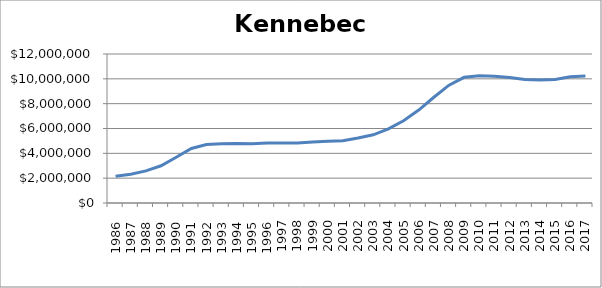
| Category | Kennebec (000s) |
|---|---|
|       1986 | 2160900 |
|       1987 | 2319050 |
|       1988 | 2584950 |
|       1989 | 2997750 |
|       1990 | 3680200 |
|       1991 | 4391200 |
|       1992 | 4715000 |
|       1993 | 4767550 |
|       1994 | 4791700 |
|       1995 | 4776250 |
|       1996 | 4825650 |
| 1997 | 4824650 |
| 1998 | 4836450 |
| 1999 | 4917550 |
| 2000 | 4970550 |
| 2001 | 5010300 |
| 2002 | 5235700 |
| 2003 | 5493700 |
| 2004 | 5965750 |
| 2005 | 6618800 |
| 2006 | 7484300 |
| 2007 | 8515400 |
| 2008 | 9490450 |
| 2009 | 10123650 |
| 2010 | 10253150 |
| 2011 | 10208650 |
| 2012 | 10100400 |
| 2013 | 9955750 |
| 2014 | 9900050 |
| 2015 | 9955450 |
| 2016 | 10171400 |
| 2017 | 10226350 |